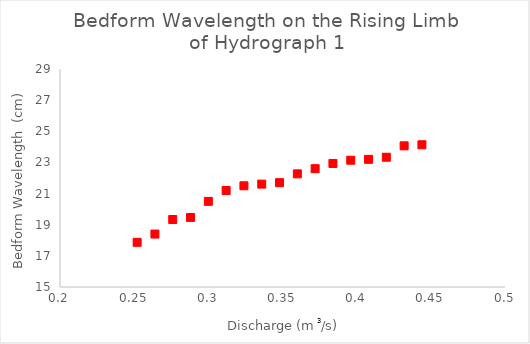
| Category | Series 0 |
|---|---|
| 0.252 | 17.87 |
| 0.264 | 18.4 |
| 0.276 | 19.333 |
| 0.288 | 19.467 |
| 0.3 | 20.5 |
| 0.312 | 21.2 |
| 0.324 | 21.5 |
| 0.336 | 21.607 |
| 0.348 | 21.7 |
| 0.36 | 22.267 |
| 0.372 | 22.6 |
| 0.384 | 22.933 |
| 0.396 | 23.143 |
| 0.40800000000000003 | 23.2 |
| 0.42 | 23.333 |
| 0.432 | 24.067 |
| 0.444 | 24.133 |